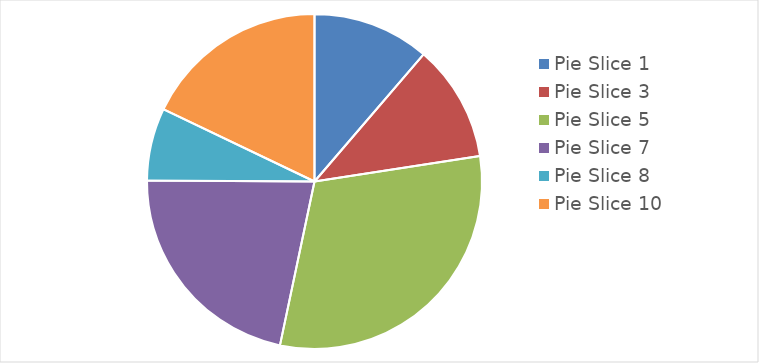
| Category | Value |
|---|---|
| Pie Slice 1 | 29 |
| Pie Slice 3 | 29 |
| Pie Slice 5 | 79 |
| Pie Slice 7 | 56 |
| Pie Slice 8 | 18 |
| Pie Slice 10 | 46 |